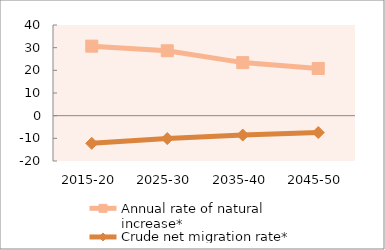
| Category | Annual rate of natural increase* | Crude net migration rate* |
|---|---|---|
| 2015-20 | 30.671 | -12.201 |
| 2025-30 | 28.635 | -10.091 |
| 2035-40 | 23.405 | -8.546 |
| 2045-50 | 20.812 | -7.429 |